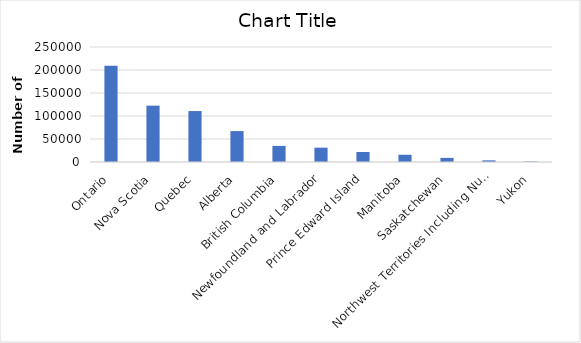
| Category | Series 0 |
|---|---|
| Ontario | 209389 |
| Nova Scotia | 122505 |
| Quebec | 110769 |
| Alberta | 67195 |
| British Columbia | 34985 |
| Newfoundland and Labrador | 31122 |
| Prince Edward Island | 21767 |
| Manitoba | 15724 |
| Saskatchewan | 8919 |
| Northwest Territories Including Nunavut | 3565 |
| Yukon | 1036 |